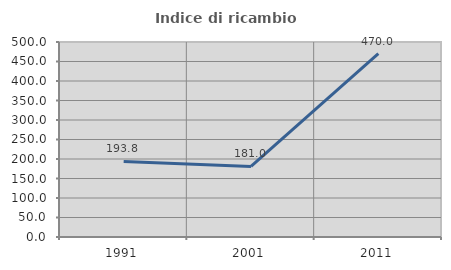
| Category | Indice di ricambio occupazionale  |
|---|---|
| 1991.0 | 193.827 |
| 2001.0 | 181.013 |
| 2011.0 | 470 |